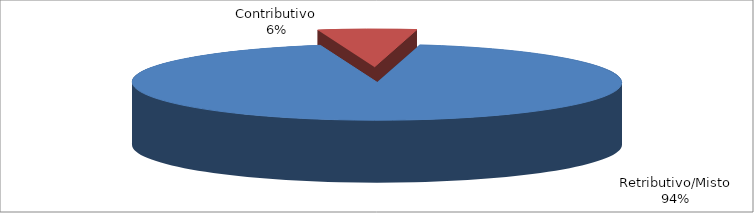
| Category | Series 1 |
|---|---|
| Retributivo/Misto | 91066 |
| Contributivo | 6328 |